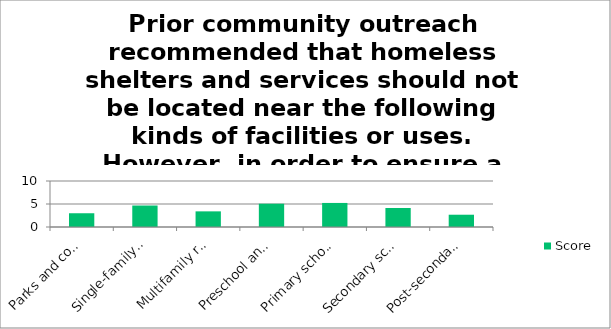
| Category | Score |
|---|---|
| Parks and community centers | 2.99 |
| Single-family residential | 4.67 |
| Multifamily residential | 3.4 |
| Preschool and childcare centers | 5.06 |
| Primary school (elementary) | 5.23 |
| Secondary school (middle and high) | 4.13 |
| Post-secondary school (colleges) | 2.67 |